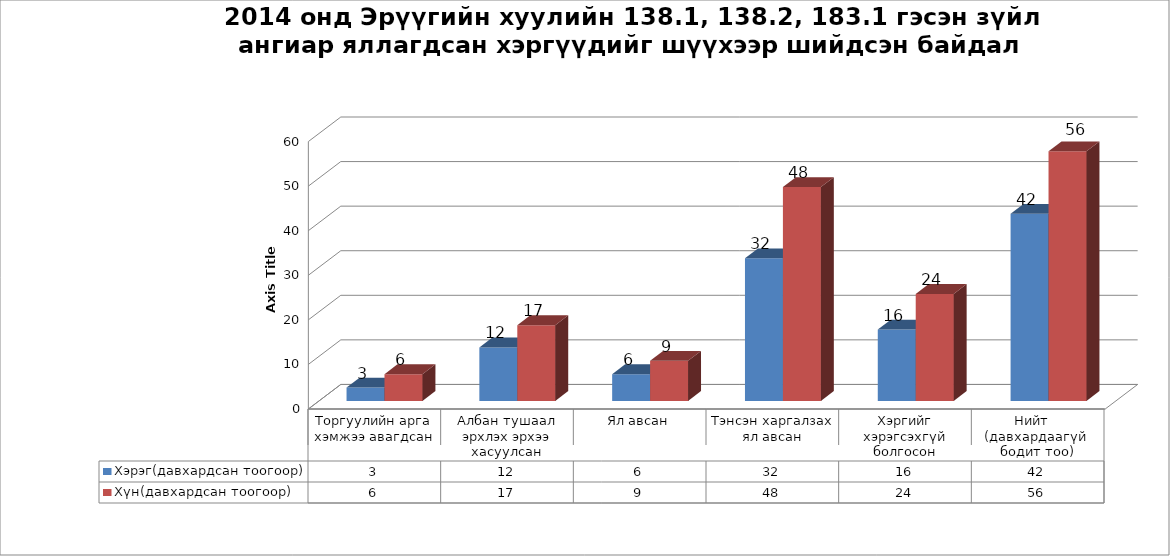
| Category | Хэрэг(давхардсан тоогоор) | Хүн(давхардсан тоогоор) |
|---|---|---|
| Торгуулийн арга хэмжээ авагдсан | 3 | 6 |
| Албан тушаал эрхлэх эрхээ хасуулсан | 12 | 17 |
| Ял авсан | 6 | 9 |
| Тэнсэн харгалзах ял авсан | 32 | 48 |
| Хэргийг хэрэгсэхгүй болгосон | 16 | 24 |
| Нийт    (давхардаагүй  бодит тоо) | 42 | 56 |